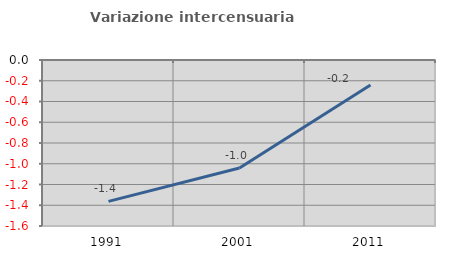
| Category | Variazione intercensuaria annua |
|---|---|
| 1991.0 | -1.362 |
| 2001.0 | -1.042 |
| 2011.0 | -0.241 |